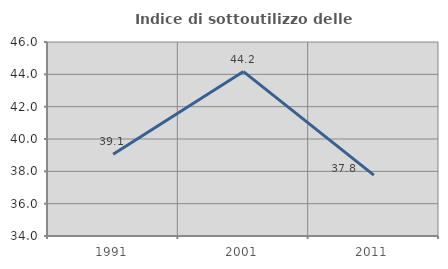
| Category | Indice di sottoutilizzo delle abitazioni  |
|---|---|
| 1991.0 | 39.052 |
| 2001.0 | 44.169 |
| 2011.0 | 37.764 |